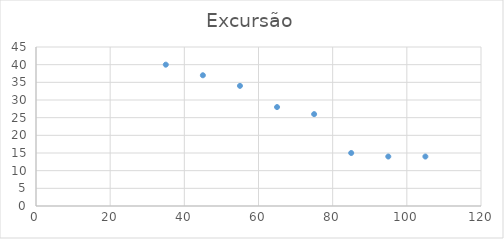
| Category | Excursão |
|---|---|
| 35.0 | 40 |
| 45.0 | 37 |
| 55.0 | 34 |
| 65.0 | 28 |
| 75.0 | 26 |
| 85.0 | 15 |
| 95.0 | 14 |
| 105.0 | 14 |